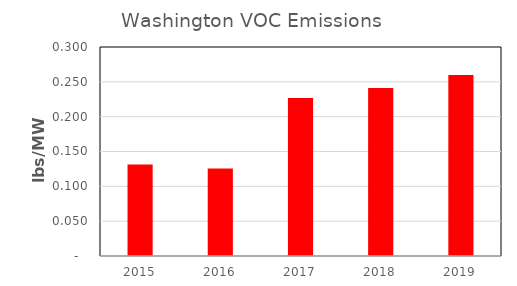
| Category | Series 0 |
|---|---|
| 2015.0 | 0.131 |
| 2016.0 | 0.126 |
| 2017.0 | 0.227 |
| 2018.0 | 0.241 |
| 2019.0 | 0.26 |